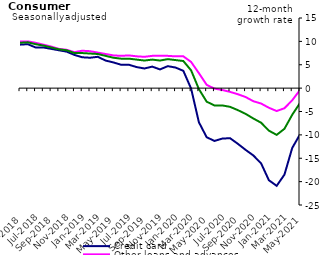
| Category | Credit card | Other loans and advances | Total |
|---|---|---|---|
| May-2018 | 9.3 | 10 | 9.7 |
| Jun-2018 | 9.4 | 10 | 9.8 |
| Jul-2018 | 8.7 | 9.7 | 9.4 |
| Aug-2018 | 8.7 | 9.3 | 9.1 |
| Sep-2018 | 8.4 | 8.9 | 8.7 |
| Oct-2018 | 8.1 | 8.4 | 8.3 |
| Nov-2018 | 7.8 | 8.2 | 8.1 |
| Dec-2018 | 7.1 | 7.7 | 7.5 |
| Jan-2019 | 6.6 | 8 | 7.5 |
| Feb-2019 | 6.5 | 7.9 | 7.4 |
| Mar-2019 | 6.7 | 7.6 | 7.3 |
| Apr-2019 | 5.9 | 7.3 | 6.9 |
| May-2019 | 5.5 | 7 | 6.5 |
| Jun-2019 | 5 | 6.9 | 6.3 |
| Jul-2019 | 5 | 7 | 6.3 |
| Aug-2019 | 4.5 | 6.8 | 6.1 |
| Sep-2019 | 4.2 | 6.7 | 5.9 |
| Oct-2019 | 4.6 | 6.9 | 6.1 |
| Nov-2019 | 4 | 6.9 | 5.9 |
| Dec-2019 | 4.7 | 6.9 | 6.2 |
| Jan-2020 | 4.4 | 6.8 | 6 |
| Feb-2020 | 3.7 | 6.8 | 5.8 |
| Mar-2020 | -0.1 | 5.6 | 3.8 |
| Apr-2020 | -7.3 | 3.2 | -0.2 |
| May-2020 | -10.5 | 0.7 | -2.9 |
| Jun-2020 | -11.3 | -0.1 | -3.7 |
| Jul-2020 | -10.8 | -0.4 | -3.7 |
| Aug-2020 | -10.7 | -0.8 | -4 |
| Sep-2020 | -11.9 | -1.3 | -4.7 |
| Oct-2020 | -13.2 | -1.9 | -5.5 |
| Nov-2020 | -14.4 | -2.8 | -6.5 |
| Dec-2020 | -16.1 | -3.3 | -7.4 |
| Jan-2021 | -19.7 | -4.2 | -9.1 |
| Feb-2021 | -20.9 | -4.9 | -10 |
| Mar-2021 | -18.5 | -4.3 | -8.7 |
| Apr-2021 | -12.8 | -2.6 | -5.7 |
| May-2021 | -9.9 | -0.4 | -3.2 |